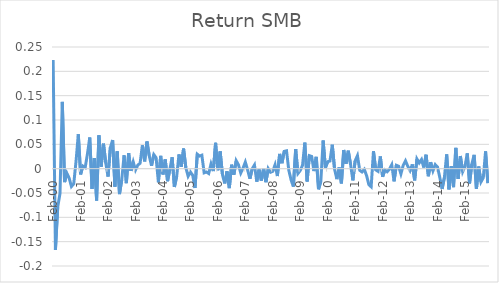
| Category | Series 0 |
|---|---|
| 2000-02-01 | 0.223 |
| 2000-03-01 | -0.167 |
| 2000-04-01 | -0.079 |
| 2000-05-01 | -0.05 |
| 2000-06-01 | 0.137 |
| 2000-07-01 | -0.028 |
| 2000-08-01 | -0.009 |
| 2000-09-01 | -0.019 |
| 2000-10-01 | -0.037 |
| 2000-11-01 | -0.031 |
| 2000-12-01 | 0.015 |
| 2001-01-01 | 0.071 |
| 2001-02-01 | -0.012 |
| 2001-03-01 | 0.005 |
| 2001-04-01 | 0.002 |
| 2001-05-01 | 0.03 |
| 2001-06-01 | 0.064 |
| 2001-07-01 | -0.042 |
| 2001-08-01 | 0.022 |
| 2001-09-01 | -0.065 |
| 2001-10-01 | 0.069 |
| 2001-11-01 | 0.004 |
| 2001-12-01 | 0.051 |
| 2002-01-01 | 0.012 |
| 2002-02-01 | -0.016 |
| 2002-03-01 | 0.043 |
| 2002-04-01 | 0.059 |
| 2002-05-01 | -0.037 |
| 2002-06-01 | 0.036 |
| 2002-07-01 | -0.052 |
| 2002-08-01 | -0.023 |
| 2002-09-01 | 0.028 |
| 2002-10-01 | -0.03 |
| 2002-11-01 | 0.032 |
| 2002-12-01 | -0.004 |
| 2003-01-01 | 0.014 |
| 2003-02-01 | -0.003 |
| 2003-03-01 | 0.007 |
| 2003-04-01 | 0.011 |
| 2003-05-01 | 0.048 |
| 2003-06-01 | 0.015 |
| 2003-07-01 | 0.056 |
| 2003-08-01 | 0.026 |
| 2003-09-01 | 0.006 |
| 2003-10-01 | 0.029 |
| 2003-11-01 | 0.022 |
| 2003-12-01 | -0.028 |
| 2004-01-01 | 0.026 |
| 2004-02-01 | -0.012 |
| 2004-03-01 | 0.019 |
| 2004-04-01 | -0.026 |
| 2004-05-01 | -0.002 |
| 2004-06-01 | 0.023 |
| 2004-07-01 | -0.038 |
| 2004-08-01 | -0.016 |
| 2004-09-01 | 0.029 |
| 2004-10-01 | 0.004 |
| 2004-11-01 | 0.041 |
| 2004-12-01 | 0.002 |
| 2005-01-01 | -0.016 |
| 2005-02-01 | -0.007 |
| 2005-03-01 | -0.014 |
| 2005-04-01 | -0.04 |
| 2005-05-01 | 0.03 |
| 2005-06-01 | 0.026 |
| 2005-07-01 | 0.028 |
| 2005-08-01 | -0.008 |
| 2005-09-01 | -0.007 |
| 2005-10-01 | -0.01 |
| 2005-11-01 | 0.01 |
| 2005-12-01 | -0.005 |
| 2006-01-01 | 0.053 |
| 2006-02-01 | -0.003 |
| 2006-03-01 | 0.035 |
| 2006-04-01 | -0.012 |
| 2006-05-01 | -0.03 |
| 2006-06-01 | -0.006 |
| 2006-07-01 | -0.04 |
| 2006-08-01 | 0.008 |
| 2006-09-01 | -0.012 |
| 2006-10-01 | 0.016 |
| 2006-11-01 | 0.008 |
| 2006-12-01 | -0.009 |
| 2007-01-01 | 0.001 |
| 2007-02-01 | 0.014 |
| 2007-03-01 | -0.003 |
| 2007-04-01 | -0.021 |
| 2007-05-01 | 0 |
| 2007-06-01 | 0.008 |
| 2007-07-01 | -0.027 |
| 2007-08-01 | -0.002 |
| 2007-09-01 | -0.024 |
| 2007-10-01 | 0.001 |
| 2007-11-01 | -0.028 |
| 2007-12-01 | 0 |
| 2008-01-01 | -0.007 |
| 2008-02-01 | -0.006 |
| 2008-03-01 | 0.008 |
| 2008-04-01 | -0.015 |
| 2008-05-01 | 0.03 |
| 2008-06-01 | 0.011 |
| 2008-07-01 | 0.036 |
| 2008-08-01 | 0.037 |
| 2008-09-01 | -0.003 |
| 2008-10-01 | -0.023 |
| 2008-11-01 | -0.037 |
| 2008-12-01 | 0.04 |
| 2009-01-01 | -0.01 |
| 2009-02-01 | -0.004 |
| 2009-03-01 | 0.007 |
| 2009-04-01 | 0.054 |
| 2009-05-01 | -0.026 |
| 2009-06-01 | 0.027 |
| 2009-07-01 | 0.025 |
| 2009-08-01 | -0.005 |
| 2009-09-01 | 0.024 |
| 2009-10-01 | -0.042 |
| 2009-11-01 | -0.026 |
| 2009-12-01 | 0.058 |
| 2010-01-01 | 0.002 |
| 2010-02-01 | 0.014 |
| 2010-03-01 | 0.016 |
| 2010-04-01 | 0.049 |
| 2010-05-01 | -0.001 |
| 2010-06-01 | -0.022 |
| 2010-07-01 | 0.002 |
| 2010-08-01 | -0.03 |
| 2010-09-01 | 0.038 |
| 2010-10-01 | 0.01 |
| 2010-11-01 | 0.037 |
| 2010-12-01 | 0.008 |
| 2011-01-01 | -0.024 |
| 2011-02-01 | 0.016 |
| 2011-03-01 | 0.027 |
| 2011-04-01 | -0.003 |
| 2011-05-01 | -0.007 |
| 2011-06-01 | -0.001 |
| 2011-07-01 | -0.014 |
| 2011-08-01 | -0.033 |
| 2011-09-01 | -0.037 |
| 2011-10-01 | 0.036 |
| 2011-11-01 | -0.002 |
| 2011-12-01 | -0.006 |
| 2012-01-01 | 0.025 |
| 2012-02-01 | -0.016 |
| 2012-03-01 | -0.003 |
| 2012-04-01 | -0.006 |
| 2012-05-01 | -0.001 |
| 2012-06-01 | 0.008 |
| 2012-07-01 | -0.026 |
| 2012-08-01 | 0.007 |
| 2012-09-01 | 0.005 |
| 2012-10-01 | -0.011 |
| 2012-11-01 | 0.007 |
| 2012-12-01 | 0.016 |
| 2013-01-01 | 0.005 |
| 2013-02-01 | -0.004 |
| 2013-03-01 | 0.009 |
| 2013-04-01 | -0.024 |
| 2013-05-01 | 0.02 |
| 2013-06-01 | 0.012 |
| 2013-07-01 | 0.019 |
| 2013-08-01 | 0.002 |
| 2013-09-01 | 0.029 |
| 2013-10-01 | -0.016 |
| 2013-11-01 | 0.013 |
| 2013-12-01 | -0.004 |
| 2014-01-01 | 0.008 |
| 2014-02-01 | 0.003 |
| 2014-03-01 | -0.018 |
| 2014-04-01 | -0.042 |
| 2014-05-01 | -0.018 |
| 2014-06-01 | 0.029 |
| 2014-07-01 | -0.042 |
| 2014-08-01 | 0.005 |
| 2014-09-01 | -0.038 |
| 2014-10-01 | 0.043 |
| 2014-11-01 | -0.021 |
| 2014-12-01 | 0.026 |
| 2015-01-01 | -0.006 |
| 2015-02-01 | 0.005 |
| 2015-03-01 | 0.031 |
| 2015-04-01 | -0.03 |
| 2015-05-01 | 0.01 |
| 2015-06-01 | 0.028 |
| 2015-07-01 | -0.042 |
| 2015-08-01 | 0.004 |
| 2015-09-01 | -0.027 |
| 2015-10-01 | -0.019 |
| 2015-11-01 | 0.036 |
| 2015-12-01 | -0.03 |